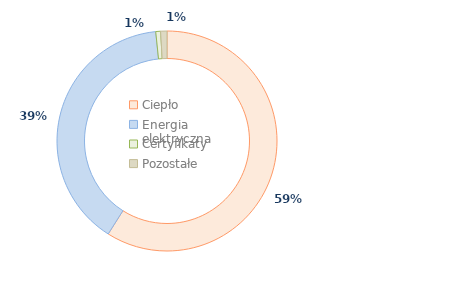
| Category | Series 0 |
|---|---|
| Ciepło | 58.977 |
| Energia elektryczna | 39.388 |
| Certyfikaty | 0.708 |
| Pozostałe | 0.927 |